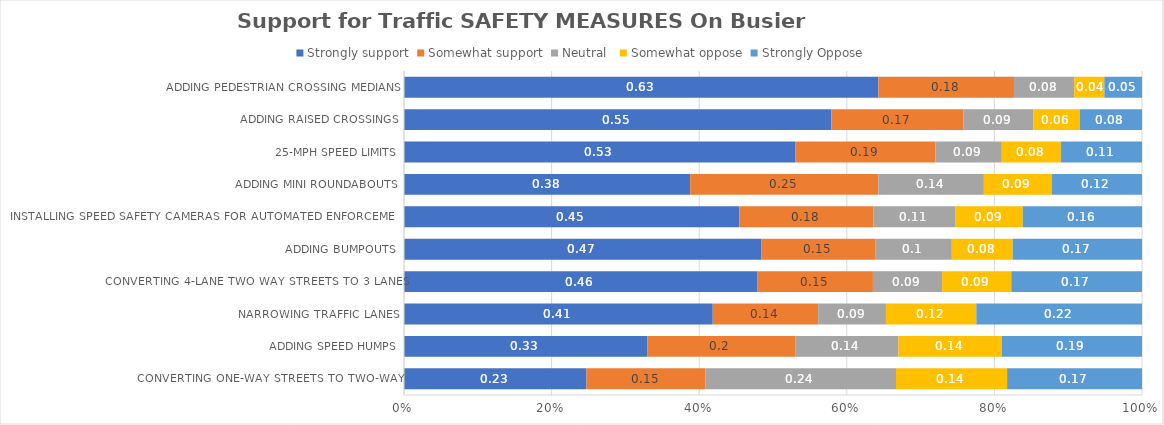
| Category | Strongly support | Somewhat support | Neutral  | Somewhat oppose | Strongly Oppose |
|---|---|---|---|---|---|
| Converting one-way streets to two-way  | 0.23 | 0.15 | 0.24 | 0.14 | 0.17 |
| Adding speed humps | 0.33 | 0.2 | 0.14 | 0.14 | 0.19 |
| Narrowing traffic lanes | 0.41 | 0.14 | 0.09 | 0.12 | 0.22 |
| Converting 4-lane two way streets to 3 lanes | 0.46 | 0.15 | 0.09 | 0.09 | 0.17 |
| Adding bumpouts | 0.47 | 0.15 | 0.1 | 0.08 | 0.17 |
| Installing speed safety cameras for automated enforcement | 0.45 | 0.18 | 0.11 | 0.09 | 0.16 |
| Adding mini roundabouts | 0.38 | 0.25 | 0.14 | 0.09 | 0.12 |
| 25-mph speed limits | 0.53 | 0.19 | 0.09 | 0.08 | 0.11 |
| Adding raised crossings | 0.55 | 0.17 | 0.09 | 0.06 | 0.08 |
| Adding pedestrian crossing medians | 0.63 | 0.18 | 0.08 | 0.04 | 0.05 |